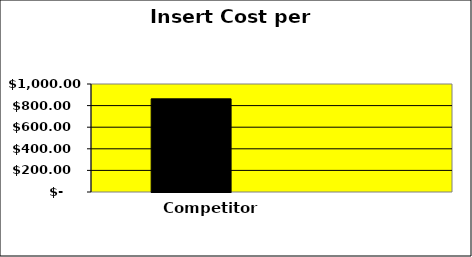
| Category | Competitor | Toshiba | Series 2 |
|---|---|---|---|
| 0 | 862.5 |  | 0 |